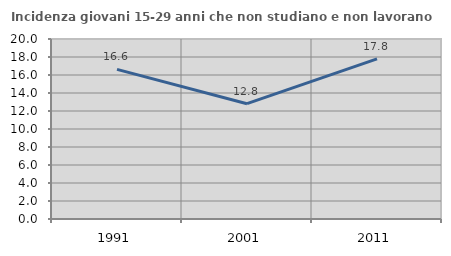
| Category | Incidenza giovani 15-29 anni che non studiano e non lavorano  |
|---|---|
| 1991.0 | 16.628 |
| 2001.0 | 12.811 |
| 2011.0 | 17.792 |